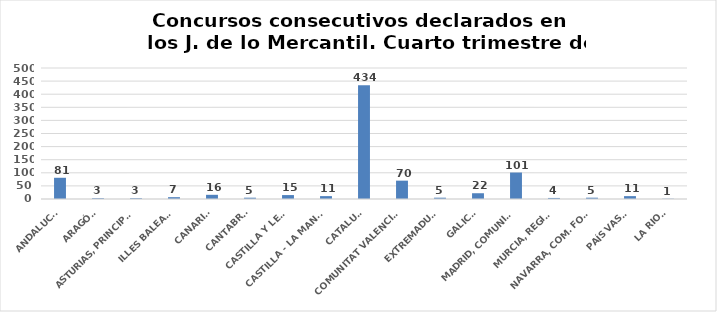
| Category | Series 0 |
|---|---|
| ANDALUCÍA | 81 |
| ARAGÓN | 3 |
| ASTURIAS, PRINCIPADO | 3 |
| ILLES BALEARS | 7 |
| CANARIAS | 16 |
| CANTABRIA | 5 |
| CASTILLA Y LEÓN | 15 |
| CASTILLA - LA MANCHA | 11 |
| CATALUÑA | 434 |
| COMUNITAT VALENCIANA | 70 |
| EXTREMADURA | 5 |
| GALICIA | 22 |
| MADRID, COMUNIDAD | 101 |
| MURCIA, REGIÓN | 4 |
| NAVARRA, COM. FORAL | 5 |
| PAÍS VASCO | 11 |
| LA RIOJA | 1 |